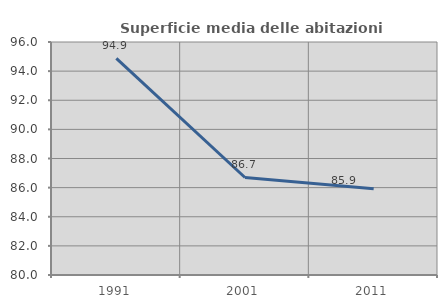
| Category | Superficie media delle abitazioni occupate |
|---|---|
| 1991.0 | 94.877 |
| 2001.0 | 86.696 |
| 2011.0 | 85.925 |